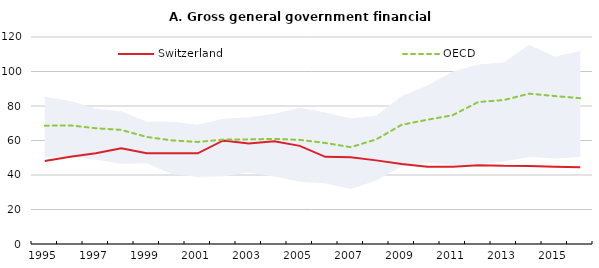
| Category | Switzerland | OECD |
|---|---|---|
| 1995.0 | 48.078 | 68.594 |
| 1996.0 | 50.528 | 68.767 |
| 1997.0 | 52.612 | 67.107 |
| 1998.0 | 55.451 | 66.147 |
| 1999.0 | 52.547 | 62.055 |
| 2000.0 | 52.572 | 60.041 |
| 2001.0 | 52.55 | 59.157 |
| 2002.0 | 60.045 | 60.517 |
| 2003.0 | 58.325 | 60.637 |
| 2004.0 | 59.578 | 60.947 |
| 2005.0 | 56.887 | 60.365 |
| 2006.0 | 50.51 | 58.592 |
| 2007.0 | 50.238 | 56.134 |
| 2008.0 | 48.478 | 60.646 |
| 2009.0 | 46.316 | 69.125 |
| 2010.0 | 44.72 | 72.017 |
| 2011.0 | 44.842 | 74.67 |
| 2012.0 | 45.657 | 82.31 |
| 2013.0 | 45.295 | 83.448 |
| 2014.0 | 45.262 | 87.163 |
| 2015.0 | 44.826 | 85.758 |
| 2016.0 | 44.443 | 84.537 |